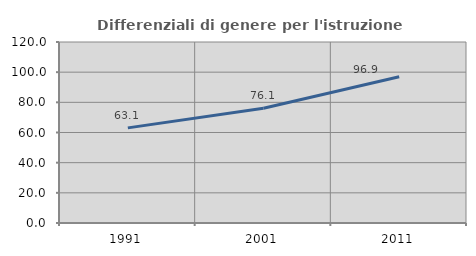
| Category | Differenziali di genere per l'istruzione superiore |
|---|---|
| 1991.0 | 63.058 |
| 2001.0 | 76.11 |
| 2011.0 | 96.936 |